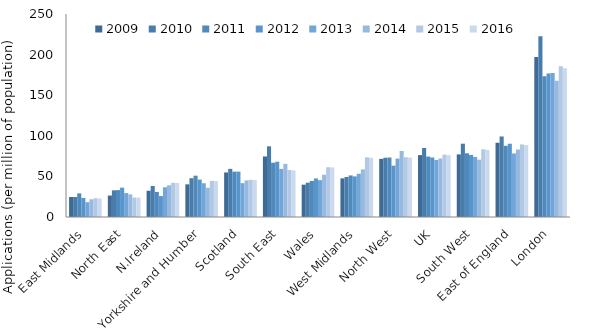
| Category | 2009 | 2010 | 2011 | 2012 | 2013 | 2014 | 2015 | 2016 |
|---|---|---|---|---|---|---|---|---|
| East Midlands | 24.599 | 24.628 | 29.092 | 23.425 | 18.267 | 21.779 | 23.092 | 22.86 |
| North East | 26.404 | 32.858 | 33.123 | 36.122 | 29.496 | 27.876 | 24.004 | 23.893 |
| N.Ireland | 32.343 | 38.231 | 30.866 | 25.773 | 36.618 | 39.12 | 42.126 | 41.888 |
| Yorkshire and Humber | 40.204 | 47.766 | 50.868 | 46.081 | 41.591 | 36.007 | 44.522 | 44.234 |
| Scotland | 54.856 | 59.291 | 55.85 | 55.894 | 41.669 | 45.067 | 45.784 | 45.516 |
| South East | 74.55 | 87.085 | 66.799 | 68.083 | 59.253 | 65.474 | 57.891 | 57.388 |
| Wales | 39.817 | 42.295 | 44.389 | 47.494 | 45.419 | 52.07 | 61.308 | 61.03 |
| West Midlands | 47.576 | 49.228 | 51.171 | 49.977 | 53.219 | 58.635 | 73.552 | 72.922 |
| North West | 71.57 | 72.936 | 73.271 | 63.238 | 71.938 | 81.312 | 73.601 | 73.134 |
| UK | 76.196 | 85.007 | 74.409 | 73.291 | 70.243 | 72.032 | 76.839 | 76.21 |
| South West | 77.103 | 90.282 | 78.479 | 76.41 | 74.011 | 70.621 | 83.346 | 82.669 |
| East of England | 91.456 | 99.184 | 87.677 | 90.227 | 78.263 | 83.079 | 89.361 | 88.574 |
| London | 197.039 | 222.539 | 173.322 | 176.689 | 177.39 | 167.824 | 185.619 | 183.206 |